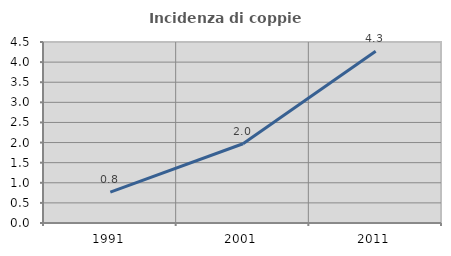
| Category | Incidenza di coppie miste |
|---|---|
| 1991.0 | 0.769 |
| 2001.0 | 1.971 |
| 2011.0 | 4.269 |